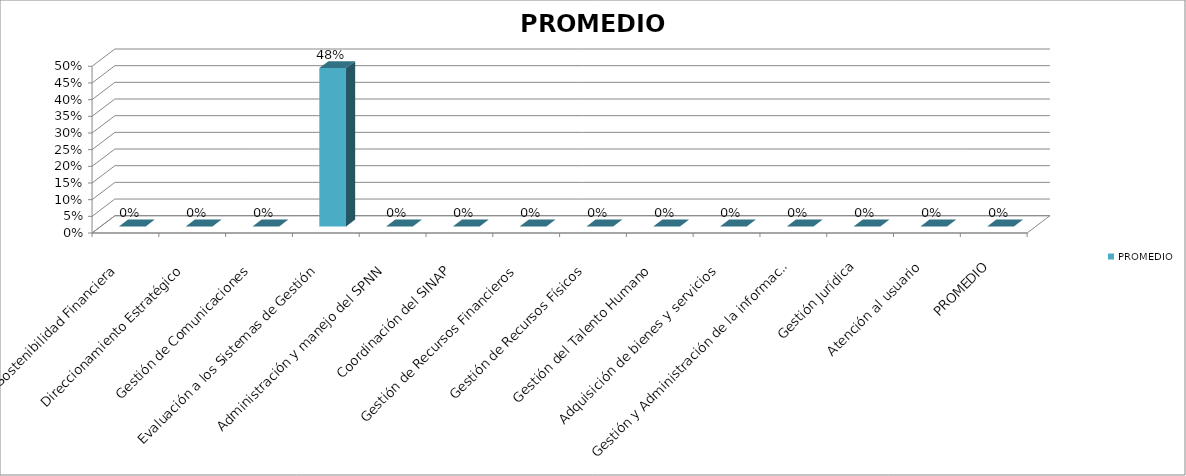
| Category | PROMEDIO  |
|---|---|
| Sostenibilidad Financiera  | 0 |
| Direccionamiento Estratégico  | 0 |
| Gestión de Comunicaciones  | 0 |
| Evaluación a los Sistemas de Gestión  | 0.475 |
| Administración y manejo del SPNN  | 0 |
| Coordinación del SINAP  | 0 |
| Gestión de Recursos Financieros  | 0 |
| Gestión de Recursos Físicos  | 0 |
| Gestión del Talento Humano  | 0 |
| Adquisición de bienes y servicios  | 0 |
| Gestión y Administración de la información  | 0 |
| Gestión Jurídica | 0 |
| Atención al usuario  | 0 |
| PROMEDIO | 0 |